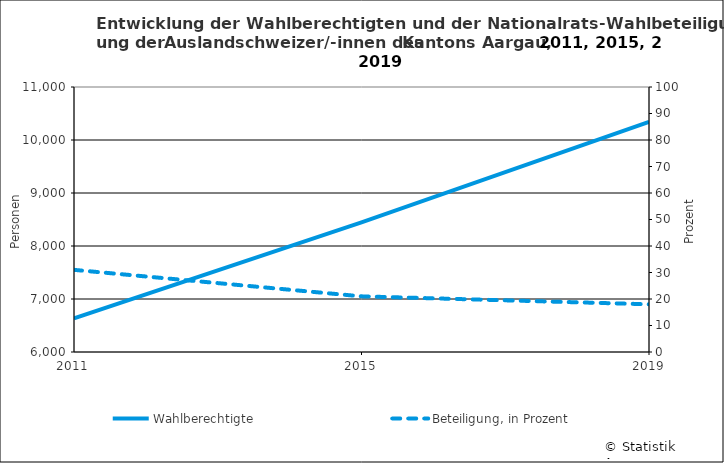
| Category | Wahlberechtigte |
|---|---|
| 2011.0 | 6634 |
| 2015.0 | 8445 |
| 2019.0 | 10343 |